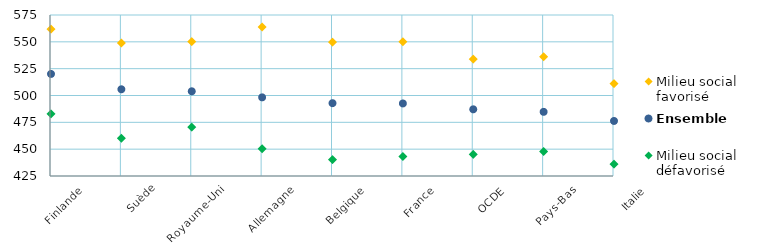
| Category | Milieu social favorisé | Ensemble | Milieu social défavorisé |
|---|---|---|---|
| Finlande | 561.78 | 520.079 | 482.963 |
| Suède | 548.875 | 505.785 | 460.254 |
| Royaume-Uni | 550.298 | 503.928 | 470.549 |
| Allemagne | 563.854 | 498.279 | 450.397 |
| Belgique | 549.694 | 492.864 | 440.216 |
| France | 550.112 | 492.606 | 443.214 |
| OCDE | 533.846 | 487.126 | 445.043 |
| Pays-Bas | 536.209 | 484.784 | 447.836 |
| Italie | 511.162 | 476.285 | 436.13 |